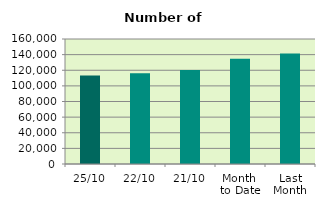
| Category | Series 0 |
|---|---|
| 25/10 | 113338 |
| 22/10 | 116064 |
| 21/10 | 120396 |
| Month 
to Date | 134706.588 |
| Last
Month | 141428.727 |